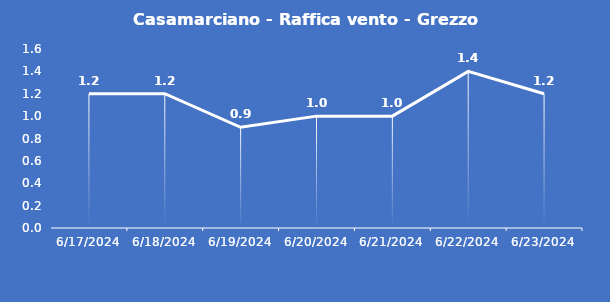
| Category | Casamarciano - Raffica vento - Grezzo (m/s) |
|---|---|
| 6/17/24 | 1.2 |
| 6/18/24 | 1.2 |
| 6/19/24 | 0.9 |
| 6/20/24 | 1 |
| 6/21/24 | 1 |
| 6/22/24 | 1.4 |
| 6/23/24 | 1.2 |